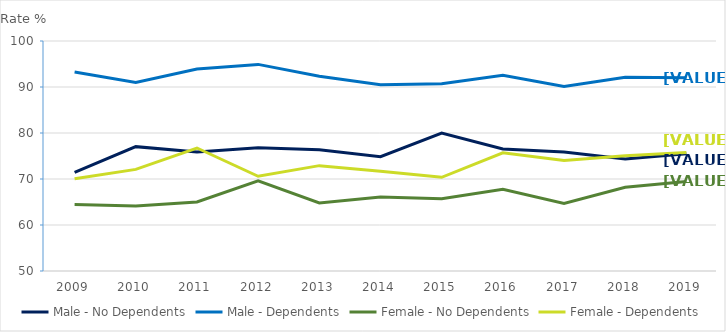
| Category | Male - No Dependents | Male - Dependents | Female - No Dependents | Female - Dependents |
|---|---|---|---|---|
| 2009.0 | 71.43 | 93.245 | 64.443 | 70.059 |
| 2010.0 | 77.034 | 90.997 | 64.132 | 72.088 |
| 2011.0 | 75.885 | 93.898 | 65.011 | 76.739 |
| 2012.0 | 76.772 | 94.915 | 69.621 | 70.6 |
| 2013.0 | 76.384 | 92.34 | 64.809 | 72.904 |
| 2014.0 | 74.858 | 90.476 | 66.094 | 71.66 |
| 2015.0 | 80 | 90.694 | 65.703 | 70.373 |
| 2016.0 | 76.506 | 92.544 | 67.782 | 75.7 |
| 2017.0 | 75.887 | 90.114 | 64.7 | 74.024 |
| 2018.0 | 74.346 | 92.134 | 68.199 | 75.047 |
| 2019.0 | 75.501 | 92.013 | 69.471 | 75.778 |